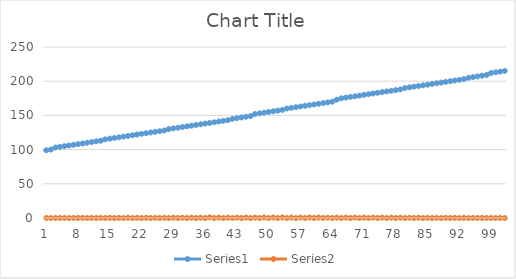
| Category | Series 0 | Series 1 |
|---|---|---|
| 0 | 99 | 0.08 |
| 1 | 100 | 0 |
| 2 | 103 | 0.076 |
| 3 | 104 | 0 |
| 4 | 105 | 0.092 |
| 5 | 106 | 0 |
| 6 | 107 | 0.101 |
| 7 | 108 | 0 |
| 8 | 109 | 0.218 |
| 9 | 110 | 0 |
| 10 | 111 | 0.139 |
| 11 | 112 | 0 |
| 12 | 113 | 0.181 |
| 13 | 115 | 0 |
| 14 | 116 | 0.231 |
| 15 | 117 | 0 |
| 16 | 118 | 0.193 |
| 17 | 119 | 0 |
| 18 | 120 | 0.311 |
| 19 | 121 | 0 |
| 20 | 122 | 0.324 |
| 21 | 123 | 0 |
| 22 | 124 | 0.344 |
| 23 | 125 | 0 |
| 24 | 126 | 0.298 |
| 25 | 127 | 0 |
| 26 | 128 | 0.361 |
| 27 | 130 | 0 |
| 28 | 131 | 0.462 |
| 29 | 132 | 0 |
| 30 | 133 | 0.349 |
| 31 | 134 | 0 |
| 32 | 135 | 0.454 |
| 33 | 136 | 0 |
| 34 | 137 | 0.429 |
| 35 | 138 | 0 |
| 36 | 139 | 1 |
| 37 | 140 | 0 |
| 38 | 141 | 0.483 |
| 39 | 142 | 0 |
| 40 | 143 | 0.529 |
| 41 | 145 | 0 |
| 42 | 146 | 0.567 |
| 43 | 147 | 0 |
| 44 | 148 | 0.639 |
| 45 | 149 | 0 |
| 46 | 152 | 0.634 |
| 47 | 153 | 0 |
| 48 | 154 | 0.731 |
| 49 | 155 | 0 |
| 50 | 156 | 0.765 |
| 51 | 157 | 0 |
| 52 | 158 | 0.79 |
| 53 | 160 | 0 |
| 54 | 161 | 0.685 |
| 55 | 162 | 0 |
| 56 | 163 | 0.714 |
| 57 | 164 | 0 |
| 58 | 165 | 0.718 |
| 59 | 166 | 0 |
| 60 | 167 | 0.702 |
| 61 | 168 | 0 |
| 62 | 169 | 0.538 |
| 63 | 170 | 0 |
| 64 | 173 | 0.571 |
| 65 | 175 | 0 |
| 66 | 176 | 0.605 |
| 67 | 177 | 0 |
| 68 | 178 | 0.63 |
| 69 | 179 | 0 |
| 70 | 180 | 0.55 |
| 71 | 181 | 0 |
| 72 | 182 | 0.563 |
| 73 | 183 | 0 |
| 74 | 184 | 0.567 |
| 75 | 185 | 0 |
| 76 | 186 | 0.538 |
| 77 | 187 | 0 |
| 78 | 188 | 0.483 |
| 79 | 190 | 0 |
| 80 | 191 | 0.382 |
| 81 | 192 | 0 |
| 82 | 193 | 0.416 |
| 83 | 194 | 0 |
| 84 | 195 | 0.361 |
| 85 | 196 | 0 |
| 86 | 197 | 0.24 |
| 87 | 198 | 0 |
| 88 | 199 | 0.223 |
| 89 | 200 | 0 |
| 90 | 201 | 0.176 |
| 91 | 202 | 0 |
| 92 | 203 | 0.206 |
| 93 | 205 | 0 |
| 94 | 206 | 0.101 |
| 95 | 207 | 0 |
| 96 | 208 | 0.071 |
| 97 | 209 | 0 |
| 98 | 212 | 0.08 |
| 99 | 213 | 0 |
| 100 | 214 | 0.084 |
| 101 | 215 | 0 |